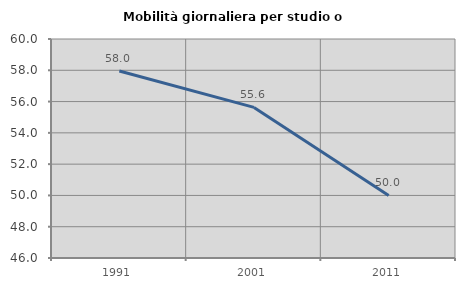
| Category | Mobilità giornaliera per studio o lavoro |
|---|---|
| 1991.0 | 57.951 |
| 2001.0 | 55.628 |
| 2011.0 | 50 |